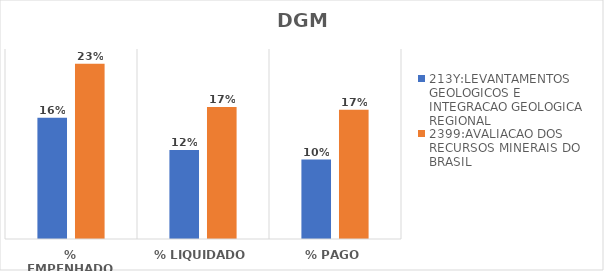
| Category | 213Y:LEVANTAMENTOS GEOLOGICOS E INTEGRACAO GEOLOGICA REGIONAL | 2399:AVALIACAO DOS RECURSOS MINERAIS DO BRASIL |
|---|---|---|
| % EMPENHADO | 0.16 | 0.231 |
| % LIQUIDADO | 0.117 | 0.174 |
| % PAGO | 0.105 | 0.17 |